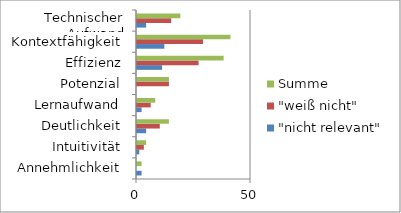
| Category | "nicht relevant" | "weiß nicht" | Summe |
|---|---|---|---|
| Annehmlichkeit | 2 | 0 | 2 |
| Intuitivität | 1 | 3 | 4 |
| Deutlichkeit | 4 | 10 | 14 |
| Lernaufwand | 2 | 6 | 8 |
| Potenzial | 0 | 14 | 14 |
| Effizienz | 11 | 27 | 38 |
| Kontextfähigkeit | 12 | 29 | 41 |
| Technischer Aufwand | 4 | 15 | 19 |